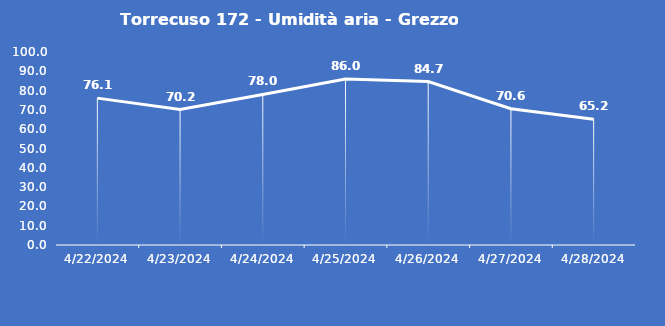
| Category | Torrecuso 172 - Umidità aria - Grezzo (%) |
|---|---|
| 4/22/24 | 76.1 |
| 4/23/24 | 70.2 |
| 4/24/24 | 78 |
| 4/25/24 | 86 |
| 4/26/24 | 84.7 |
| 4/27/24 | 70.6 |
| 4/28/24 | 65.2 |